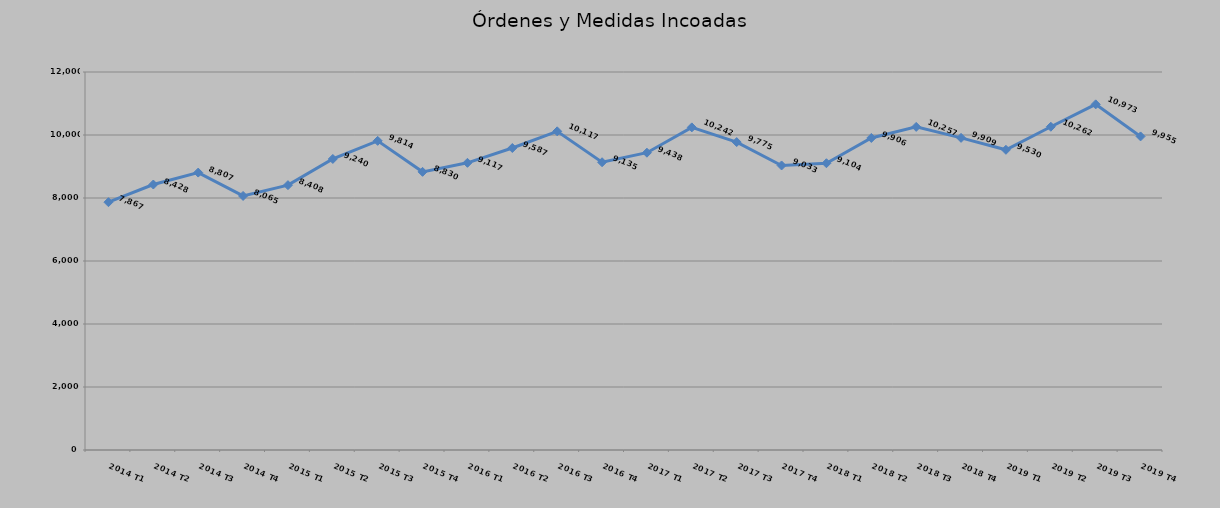
| Category | Series 0 |
|---|---|
| 2014 T1 | 7867 |
| 2014 T2 | 8428 |
| 2014 T3 | 8807 |
| 2014 T4 | 8065 |
| 2015 T1 | 8408 |
| 2015 T2 | 9240 |
| 2015 T3 | 9814 |
| 2015 T4 | 8830 |
| 2016 T1 | 9117 |
| 2016 T2 | 9587 |
| 2016 T3 | 10117 |
| 2016 T4 | 9135 |
| 2017 T1 | 9438 |
| 2017 T2 | 10242 |
| 2017 T3 | 9775 |
| 2017 T4 | 9033 |
| 2018 T1 | 9104 |
| 2018 T2 | 9906 |
| 2018 T3 | 10257 |
| 2018 T4 | 9909 |
| 2019 T1 | 9530 |
| 2019 T2 | 10262 |
| 2019 T3 | 10973 |
| 2019 T4 | 9955 |